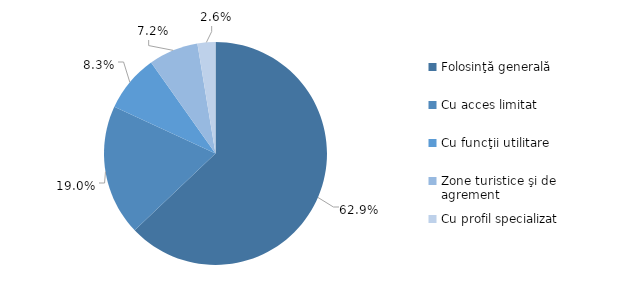
| Category | 2020 |
|---|---|
| Folosinţă generală | 0.629 |
| Cu acces limitat | 0.19 |
| Cu funcţii utilitare | 0.083 |
| Zone turistice şi de agrement | 0.072 |
| Cu profil specializat | 0.026 |